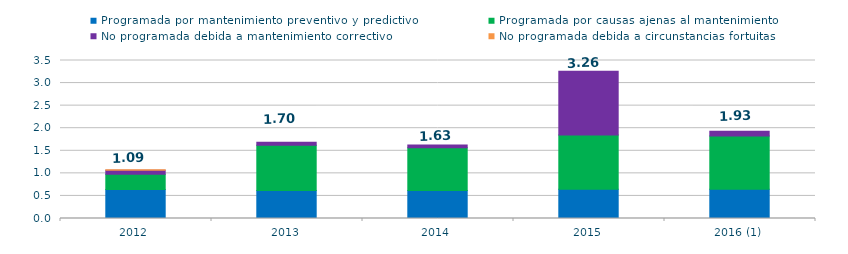
| Category | Programada por mantenimiento preventivo y predictivo | Programada por causas ajenas al mantenimiento  | No programada debida a mantenimiento correctivo  | No programada debida a circunstancias fortuitas  |
|---|---|---|---|---|
| 2012 | 0.64 | 0.34 | 0.09 | 0.01 |
| 2013 | 0.62 | 1 | 0.07 | 0 |
| 2014 | 0.62 | 0.95 | 0.06 | 0 |
| 2015 | 0.65 | 1.2 | 1.41 | 0 |
| 2016 (1) | 0.65 | 1.18 | 0.1 | 0 |